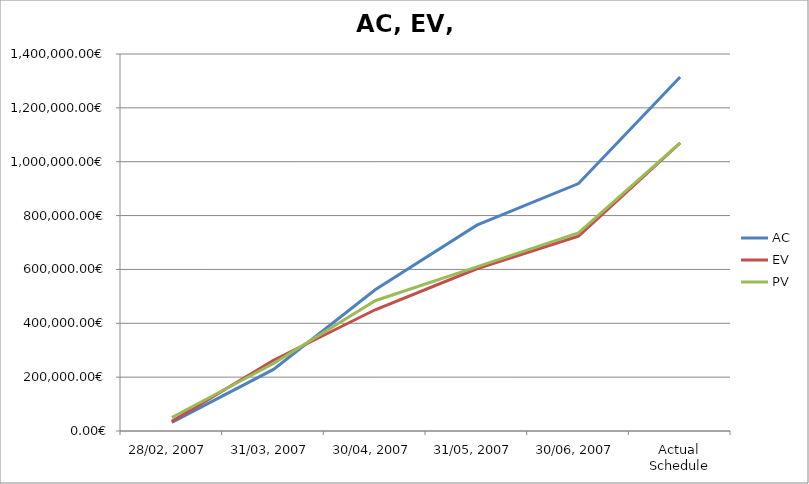
| Category | AC | EV | PV |
|---|---|---|---|
| 28/02, 2007 | 31927.879 | 35702.139 | 50238.899 |
| 31/03, 2007 | 228566.257 | 262647.006 | 250546.598 |
| 30/04, 2007 | 524633.157 | 450217.626 | 483775.947 |
| 31/05, 2007 | 764311.585 | 602515.197 | 609219.997 |
| 30/06, 2007 | 918901.824 | 723668.756 | 735852.477 |
| Actual Schedule | 1314584.581 | 1069532.415 | 1069532.415 |